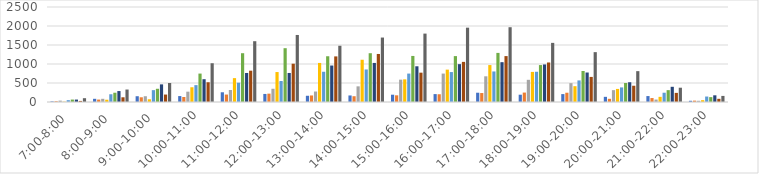
| Category | Series 0 | Series 1 | Series 2 | Series 3 | Series 4 | Series 5 | Series 6 | Series 7 | Series 8 |
|---|---|---|---|---|---|---|---|---|---|
| 7:00-8:00 | 16 | 20 | 36 | 8 | 48 | 64 | 64 | 28 | 100 |
| 8:00-9:00 | 84 | 64 | 84 | 60 | 204 | 244 | 288 | 124 | 328 |
| 9:00-10:00 | 152 | 124 | 152 | 72 | 312 | 348 | 464 | 196 | 500 |
| 10:00-11:00 | 156 | 132 | 272 | 388 | 444 | 748 | 600 | 520 | 1020 |
| 11:00-12:00 | 256 | 196 | 316 | 628 | 508 | 1284 | 764 | 824 | 1600 |
| 12:00-13:00 | 212 | 220 | 348 | 788 | 552 | 1416 | 764 | 1008 | 1764 |
| 13:00-14:00 | 164 | 172 | 276 | 1028 | 796 | 1204 | 960 | 1200 | 1480 |
| 14:00-15:00 | 172 | 152 | 412 | 1112 | 856 | 1284 | 1028 | 1264 | 1696 |
| 15:00-16:00 | 192 | 176 | 588 | 596 | 748 | 1212 | 940 | 772 | 1800 |
| 16:00-17:00 | 208 | 204 | 748 | 852 | 788 | 1208 | 996 | 1056 | 1956 |
| 17:00-18:00 | 244 | 236 | 676 | 972 | 804 | 1292 | 1048 | 1208 | 1968 |
| 18:00-19:00 | 192 | 248 | 584 | 792 | 796 | 972 | 988 | 1040 | 1556 |
| 19:00-20:00 | 208 | 244 | 496 | 416 | 568 | 816 | 776 | 660 | 1312 |
| 20:00-21:00 | 136 | 84 | 312 | 344 | 384 | 500 | 520 | 428 | 812 |
| 21:00-22:00 | 156 | 104 | 64 | 136 | 244 | 312 | 400 | 240 | 376 |
| 22:00-23:00 | 32 | 36 | 32 | 48 | 144 | 128 | 176 | 84 | 160 |